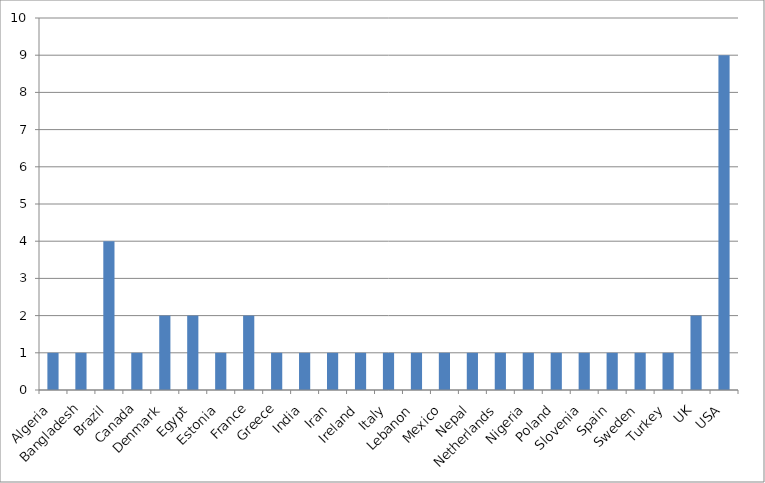
| Category | Series 0 |
|---|---|
| Algeria | 1 |
| Bangladesh | 1 |
| Brazil | 4 |
| Canada | 1 |
| Denmark | 2 |
| Egypt | 2 |
| Estonia | 1 |
| France | 2 |
| Greece | 1 |
| India | 1 |
| Iran | 1 |
| Ireland | 1 |
| Italy | 1 |
| Lebanon | 1 |
| Mexico | 1 |
| Nepal | 1 |
| Netherlands | 1 |
| Nigeria | 1 |
| Poland | 1 |
| Slovenia | 1 |
| Spain | 1 |
| Sweden | 1 |
| Turkey | 1 |
| UK | 2 |
| USA | 9 |